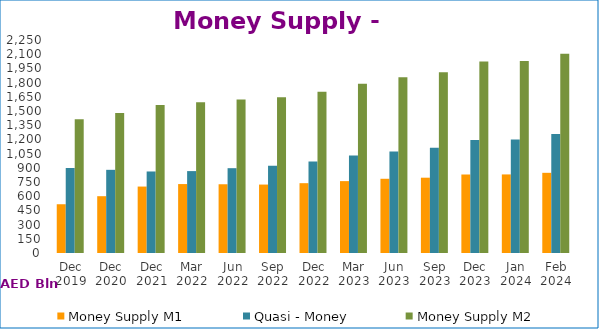
| Category | Money Supply M1 | Quasi - Money | Money Supply M2 |
|---|---|---|---|
| Dec 2019 | 515061 | 898105 | 1413166 |
| Dec 2020 | 600060 | 878547 | 1478607 |
| Dec 2021 | 701853 | 861172 | 1563025 |
| Mar 2022 | 728199 | 865155 | 1593354 |
| Jun 2022 | 726169 | 895975 | 1622144 |
| Sep 2022 | 722918 | 922620 | 1645538 |
| Dec 2022 | 737562 | 966063 | 1703625 |
| Mar 2023 | 759281 | 1029091 | 1788372 |
| Jun 2023 | 784017 | 1071289 | 1855306 |
| Sep 2023 | 795469 | 1112619 | 1908088 |
| Dec 2023 | 829264 | 1194142 | 2023406 |
| Jan 2024 | 830022 | 1198254 | 2028276 |
| Feb 2024 | 847013 | 1257731 | 2104744 |